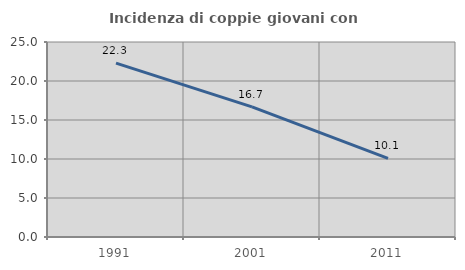
| Category | Incidenza di coppie giovani con figli |
|---|---|
| 1991.0 | 22.296 |
| 2001.0 | 16.684 |
| 2011.0 | 10.091 |